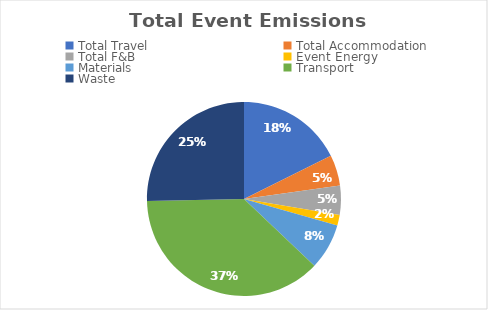
| Category | Series 0 |
|---|---|
| Total Travel | 0.69 |
| Total Accommodation | 0.2 |
| Total F&B | 0.19 |
| Event Energy | 0.07 |
| Materials | 0.3 |
| Transport | 1.47 |
| Waste | 0.99 |